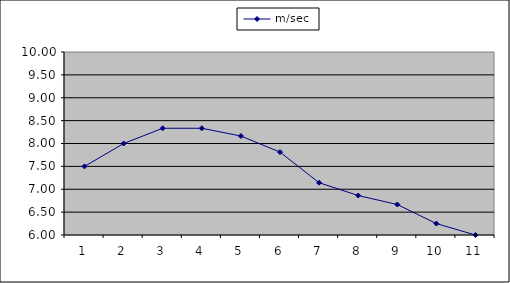
| Category | m/sec |
|---|---|
| 0 | 7.5 |
| 1 | 8 |
| 2 | 8.333 |
| 3 | 8.333 |
| 4 | 8.163 |
| 5 | 7.812 |
| 6 | 7.143 |
| 7 | 6.863 |
| 8 | 6.667 |
| 9 | 6.25 |
| 10 | 6 |